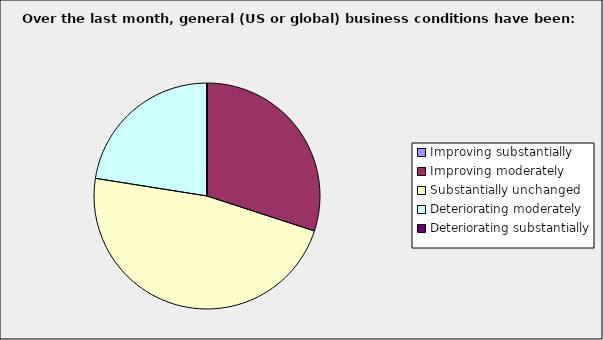
| Category | Series 0 |
|---|---|
| Improving substantially | 0 |
| Improving moderately | 0.3 |
| Substantially unchanged | 0.475 |
| Deteriorating moderately | 0.225 |
| Deteriorating substantially | 0 |